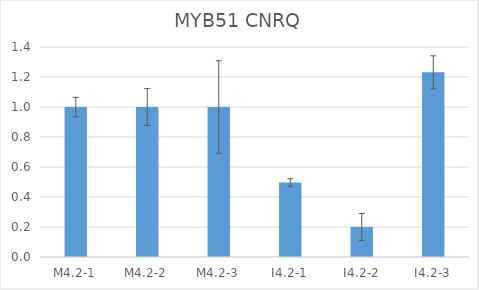
| Category | MYB51 CNRQ |
|---|---|
| M4.2-1 | 1 |
| M4.2-2 | 1 |
| M4.2-3 | 1 |
| I4.2-1 | 0.497 |
| I4.2-2 | 0.2 |
| I4.2-3 | 1.231 |